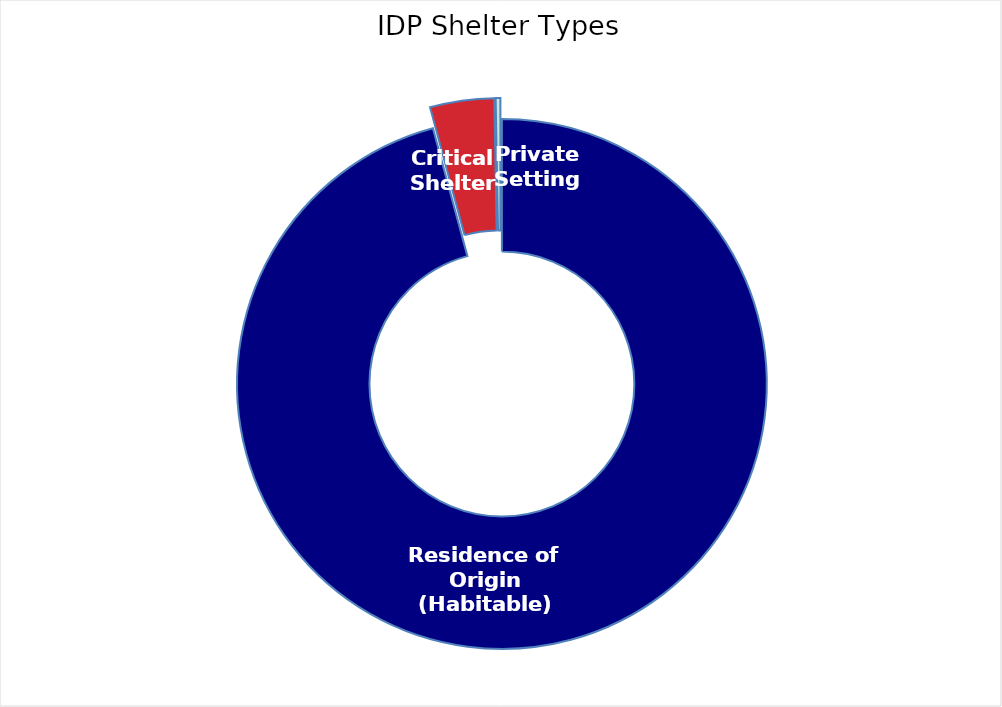
| Category | Individuals |
|---|---|
| Residence of Origin (Habitable) | 4744578 |
| Critical Shelter | 193494 |
| Private Setting | 14160 |